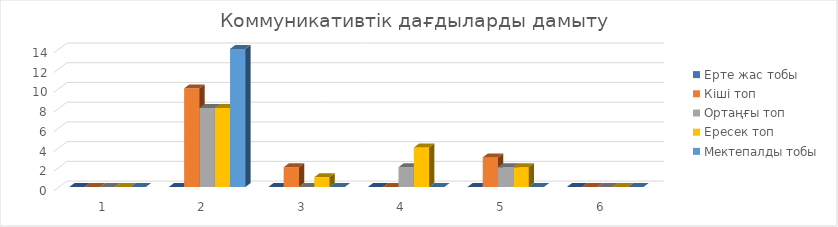
| Category | Ерте жас тобы  | Кіші топ | Ортаңғы топ | Ересек топ | Мектепалды тобы |
|---|---|---|---|---|---|
| 0 | 0 | 0 | 0 | 0 | 0 |
| 1 | 0 | 10 | 8 | 8 | 14 |
| 2 | 0 | 2 | 0 | 1 | 0 |
| 3 | 0 | 0 | 2 | 4 | 0 |
| 4 | 0 | 3 | 2 | 2 | 0 |
| 5 | 0 | 0 | 0 | 0 | 0 |